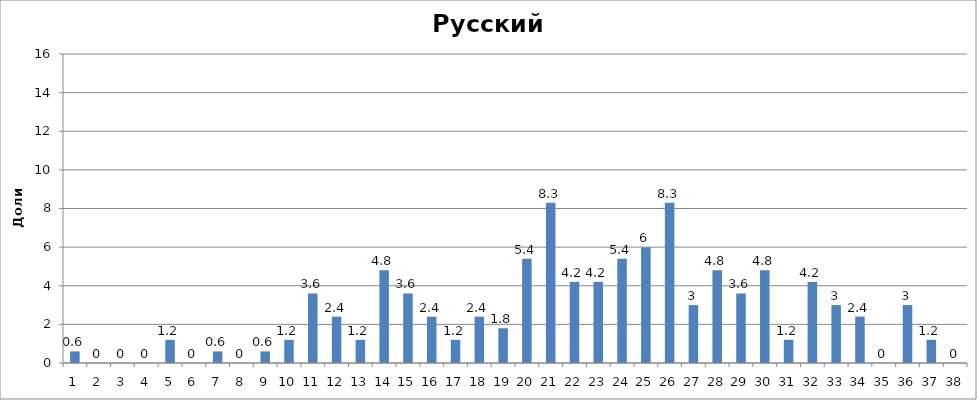
| Category | Series 0 |
|---|---|
| 0 | 0.6 |
| 1 | 0 |
| 2 | 0 |
| 3 | 0 |
| 4 | 1.2 |
| 5 | 0 |
| 6 | 0.6 |
| 7 | 0 |
| 8 | 0.6 |
| 9 | 1.2 |
| 10 | 3.6 |
| 11 | 2.4 |
| 12 | 1.2 |
| 13 | 4.8 |
| 14 | 3.6 |
| 15 | 2.4 |
| 16 | 1.2 |
| 17 | 2.4 |
| 18 | 1.8 |
| 19 | 5.4 |
| 20 | 8.3 |
| 21 | 4.2 |
| 22 | 4.2 |
| 23 | 5.4 |
| 24 | 6 |
| 25 | 8.3 |
| 26 | 3 |
| 27 | 4.8 |
| 28 | 3.6 |
| 29 | 4.8 |
| 30 | 1.2 |
| 31 | 4.2 |
| 32 | 3 |
| 33 | 2.4 |
| 34 | 0 |
| 35 | 3 |
| 36 | 1.2 |
| 37 | 0 |